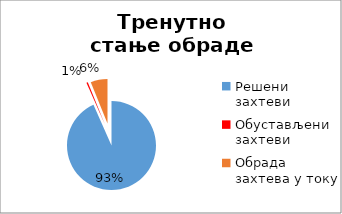
| Category | Series 0 |
|---|---|
| Решени захтеви | 27458 |
| Обустављени захтеви | 151 |
| Обрада захтева у току | 1803 |